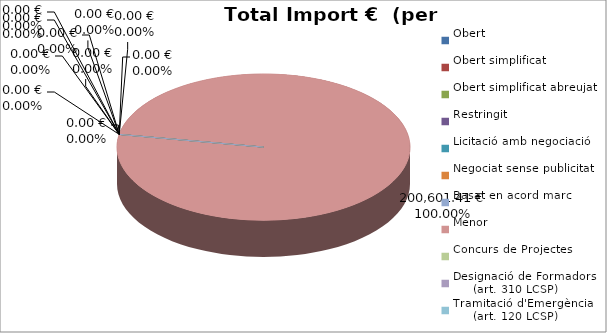
| Category | Total preu
(amb IVA) |
|---|---|
| Obert | 0 |
| Obert simplificat | 0 |
| Obert simplificat abreujat | 0 |
| Restringit | 0 |
| Licitació amb negociació | 0 |
| Negociat sense publicitat | 0 |
| Basat en acord marc | 0 |
| Menor | 200601.405 |
| Concurs de Projectes | 0 |
| Designació de Formadors
     (art. 310 LCSP) | 0 |
| Tramitació d'Emergència
     (art. 120 LCSP) | 0 |